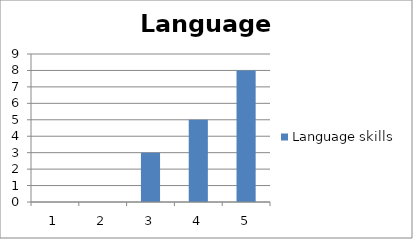
| Category | Language skills |
|---|---|
| 0 | 0 |
| 1 | 0 |
| 2 | 3 |
| 3 | 5 |
| 4 | 8 |